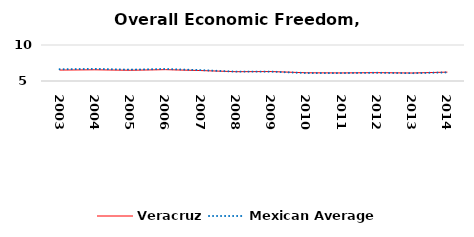
| Category | Veracruz | Mexican Average  |
|---|---|---|
| 2003.0 | 6.519 | 6.632 |
| 2004.0 | 6.558 | 6.678 |
| 2005.0 | 6.492 | 6.582 |
| 2006.0 | 6.576 | 6.668 |
| 2007.0 | 6.45 | 6.508 |
| 2008.0 | 6.294 | 6.3 |
| 2009.0 | 6.314 | 6.3 |
| 2010.0 | 6.14 | 6.105 |
| 2011.0 | 6.12 | 6.103 |
| 2012.0 | 6.161 | 6.144 |
| 2013.0 | 6.111 | 6.087 |
| 2014.0 | 6.232 | 6.195 |